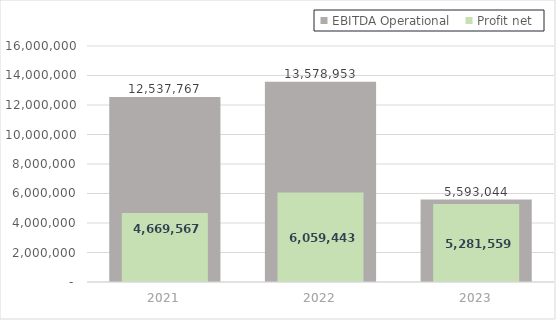
| Category | EBITDA Operational |
|---|---|
| 2021.0 | 12537766.72 |
| 2022.0 | 13578953.48 |
| 2023.0 | 5593044.28 |